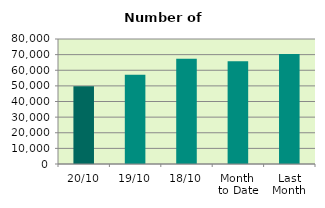
| Category | Series 0 |
|---|---|
| 20/10 | 49762 |
| 19/10 | 57186 |
| 18/10 | 67346 |
| Month 
to Date | 65691.571 |
| Last
Month | 70459.909 |